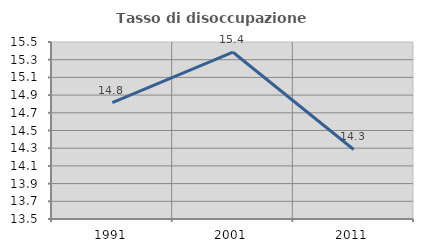
| Category | Tasso di disoccupazione giovanile  |
|---|---|
| 1991.0 | 14.815 |
| 2001.0 | 15.385 |
| 2011.0 | 14.286 |